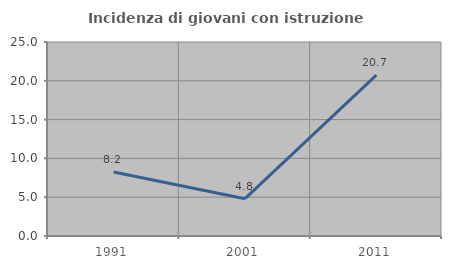
| Category | Incidenza di giovani con istruzione universitaria |
|---|---|
| 1991.0 | 8.235 |
| 2001.0 | 4.808 |
| 2011.0 | 20.721 |